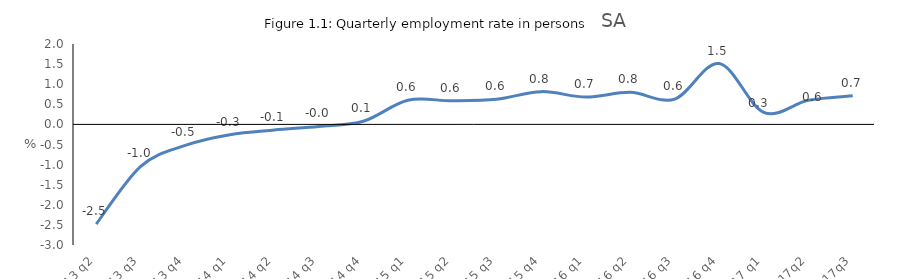
| Category | Series 0 |
|---|---|
| 2013 q2 | -2.479 |
| 2013 q3 | -1.044 |
| 2013 q4 | -0.522 |
| 2014 q1 | -0.255 |
| 2014 q2 | -0.138 |
| 2014 q3 | -0.05 |
| 2014 q4 | 0.077 |
| 2015 q1 | 0.6 |
| 2015 q2 | 0.587 |
| 2015 q3 | 0.627 |
| 2015 q4 | 0.815 |
| 2016 q1 | 0.679 |
| 2016 q2 | 0.797 |
| 2016 q3 | 0.63 |
| 2016 q4 | 1.514 |
| 2017 q1 | 0.3 |
| 2017q2 | 0.6 |
| 2017q3 | 0.713 |